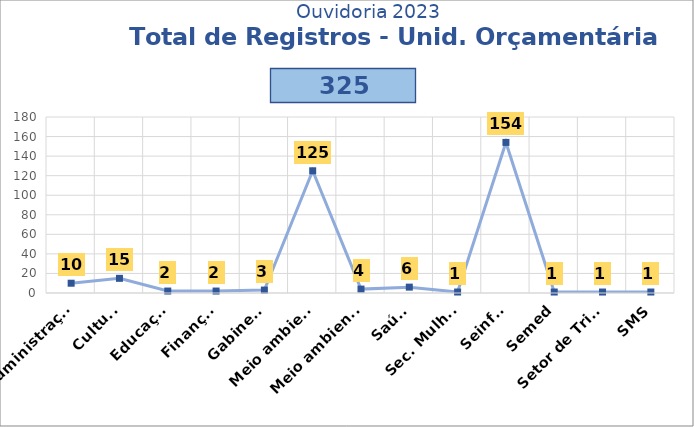
| Category | Series 2 |
|---|---|
| Administração | 10 |
| Cultura | 15 |
| Educação | 2 |
| Finanças | 2 |
| Gabinete | 3 |
| Meio ambiente | 125 |
| Meio ambiente/Seinfra | 4 |
| Saúde | 6 |
| Sec. Mulher | 1 |
| Seinfra | 154 |
| Semed | 1 |
| Setor de Tributos | 1 |
| SMS | 1 |